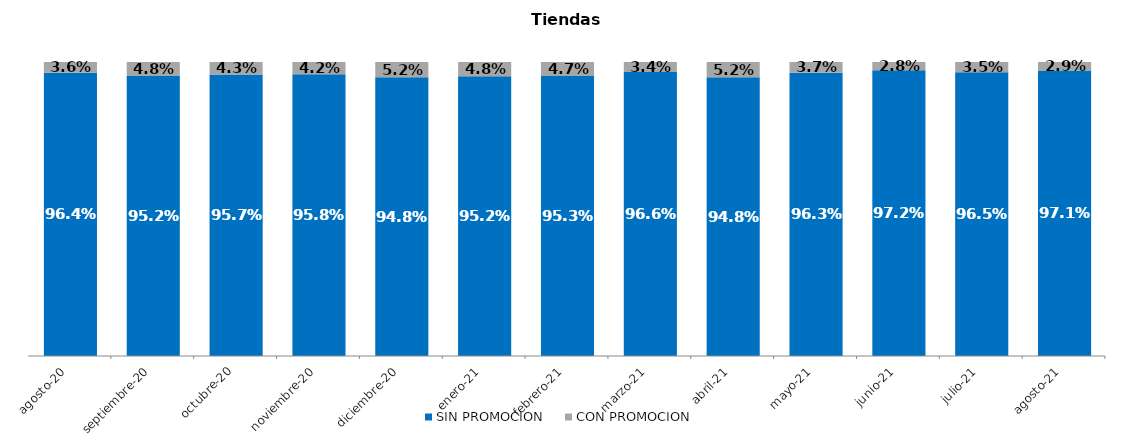
| Category | SIN PROMOCION   | CON PROMOCION   |
|---|---|---|
| 2020-08-01 | 0.964 | 0.036 |
| 2020-09-01 | 0.952 | 0.048 |
| 2020-10-01 | 0.957 | 0.043 |
| 2020-11-01 | 0.958 | 0.042 |
| 2020-12-01 | 0.948 | 0.052 |
| 2021-01-01 | 0.952 | 0.048 |
| 2021-02-01 | 0.953 | 0.047 |
| 2021-03-01 | 0.966 | 0.034 |
| 2021-04-01 | 0.948 | 0.052 |
| 2021-05-01 | 0.963 | 0.037 |
| 2021-06-01 | 0.972 | 0.028 |
| 2021-07-01 | 0.965 | 0.035 |
| 2021-08-01 | 0.971 | 0.029 |